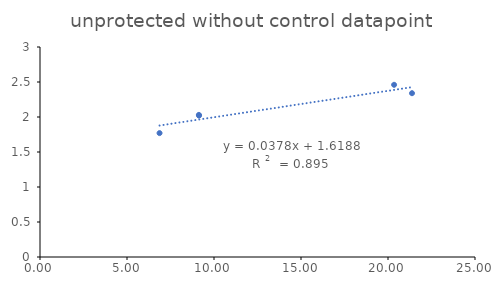
| Category | protected |
|---|---|
| 20.35 | 2.46 |
| 21.38 | 2.34 |
| 9.14 | 2.02 |
| 9.13 | 2.03 |
| 6.87 | 1.77 |